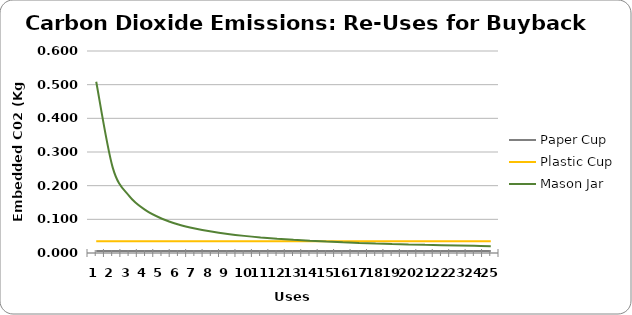
| Category | Paper Cup | Plastic Cup | Mason Jar |
|---|---|---|---|
| 0 | 0.006 | 0.035 | 0.509 |
| 1 | 0.006 | 0.035 | 0.254 |
| 2 | 0.006 | 0.035 | 0.17 |
| 3 | 0.006 | 0.035 | 0.127 |
| 4 | 0.006 | 0.035 | 0.102 |
| 5 | 0.006 | 0.035 | 0.085 |
| 6 | 0.006 | 0.035 | 0.073 |
| 7 | 0.006 | 0.035 | 0.064 |
| 8 | 0.006 | 0.035 | 0.057 |
| 9 | 0.006 | 0.035 | 0.051 |
| 10 | 0.006 | 0.035 | 0.046 |
| 11 | 0.006 | 0.035 | 0.042 |
| 12 | 0.006 | 0.035 | 0.039 |
| 13 | 0.006 | 0.035 | 0.036 |
| 14 | 0.006 | 0.035 | 0.034 |
| 15 | 0.006 | 0.035 | 0.032 |
| 16 | 0.006 | 0.035 | 0.03 |
| 17 | 0.006 | 0.035 | 0.028 |
| 18 | 0.006 | 0.035 | 0.027 |
| 19 | 0.006 | 0.035 | 0.025 |
| 20 | 0.006 | 0.035 | 0.024 |
| 21 | 0.006 | 0.035 | 0.023 |
| 22 | 0.006 | 0.035 | 0.022 |
| 23 | 0.006 | 0.035 | 0.021 |
| 24 | 0.006 | 0.035 | 0.02 |